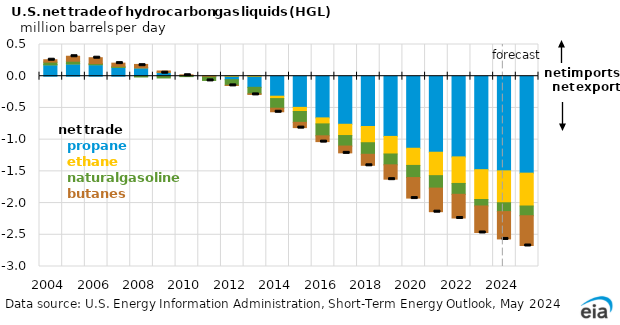
| Category | propane  | ethane | natural gasoline | butanes |
|---|---|---|---|---|
| 2004.0 | 0.181 | 0 | 0.04 | 0.038 |
| 2005.0 | 0.196 | 0.001 | 0.04 | 0.079 |
| 2006.0 | 0.182 | 0 | 0.016 | 0.093 |
| 2007.0 | 0.139 | 0 | 0.016 | 0.051 |
| 2008.0 | 0.132 | 0 | -0.012 | 0.053 |
| 2009.0 | 0.062 | 0 | -0.027 | 0.02 |
| 2010.0 | 0.012 | 0 | -0.006 | 0.009 |
| 2011.0 | -0.014 | 0 | -0.052 | 0 |
| 2012.0 | -0.055 | 0 | -0.089 | -0.001 |
| 2013.0 | -0.175 | 0 | -0.103 | -0.009 |
| 2014.0 | -0.315 | -0.038 | -0.152 | -0.056 |
| 2015.0 | -0.491 | -0.065 | -0.172 | -0.083 |
| 2016.0 | -0.657 | -0.095 | -0.188 | -0.091 |
| 2017.0 | -0.758 | -0.178 | -0.166 | -0.107 |
| 2018.0 | -0.793 | -0.256 | -0.183 | -0.174 |
| 2019.0 | -0.949 | -0.277 | -0.171 | -0.226 |
| 2020.0 | -1.136 | -0.271 | -0.192 | -0.323 |
| 2021.0 | -1.198 | -0.369 | -0.196 | -0.372 |
| 2022.0 | -1.272 | -0.419 | -0.171 | -0.373 |
| 2023.0 | -1.473 | -0.471 | -0.102 | -0.418 |
| 2024.0 | -1.492 | -0.503 | -0.139 | -0.431 |
| 2025.0 | -1.528 | -0.518 | -0.153 | -0.469 |